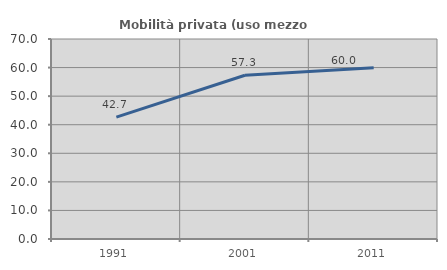
| Category | Mobilità privata (uso mezzo privato) |
|---|---|
| 1991.0 | 42.665 |
| 2001.0 | 57.313 |
| 2011.0 | 59.958 |